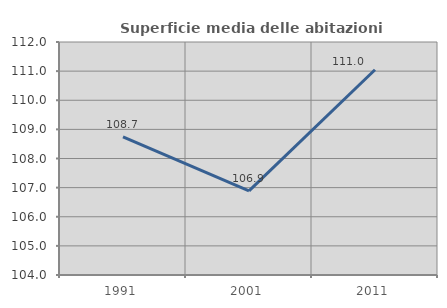
| Category | Superficie media delle abitazioni occupate |
|---|---|
| 1991.0 | 108.744 |
| 2001.0 | 106.886 |
| 2011.0 | 111.046 |